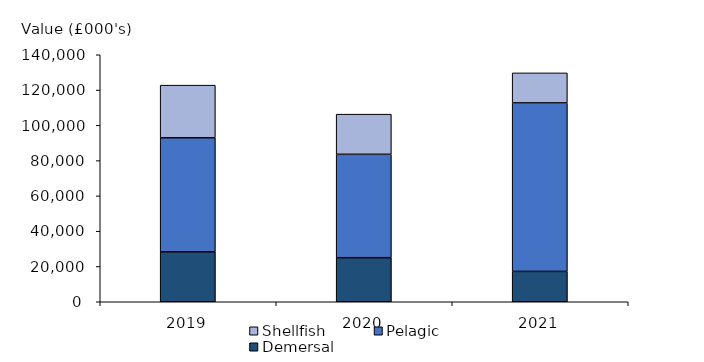
| Category | Demersal | Pelagic | Shellfish |
|---|---|---|---|
| 2019.0 | 28324.201 | 64635.17 | 29808.772 |
| 2020.0 | 24967.875 | 58613.45 | 22750.846 |
| 2021.0 | 17206.733 | 95499.717 | 17019.977 |